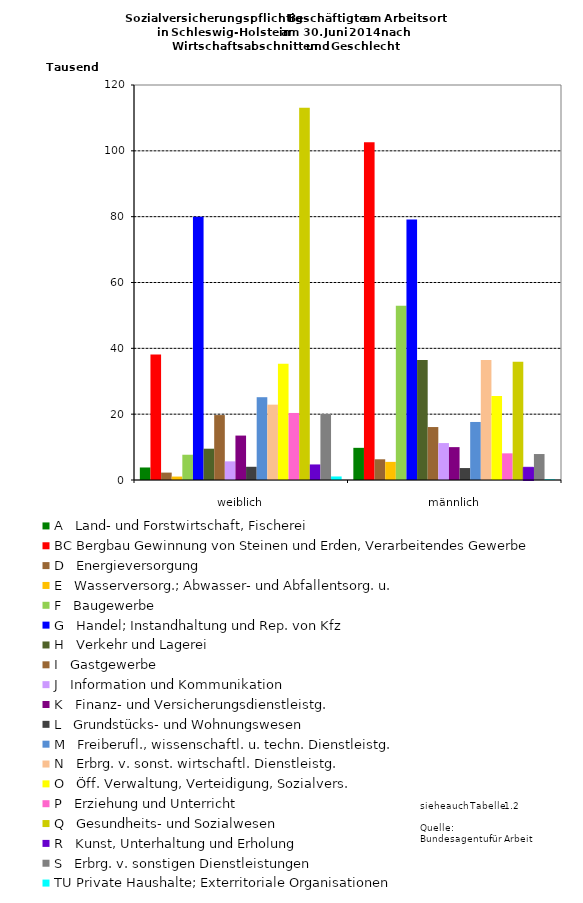
| Category | A   Land- und Forstwirtschaft, Fischerei | BC Bergbau Gewinnung von Steinen und Erden, Verarbeitendes Gewerbe | D   Energieversorgung | E   Wasserversorg.; Abwasser- und Abfallentsorg. u. | F   Baugewerbe | G   Handel; Instandhaltung und Rep. von Kfz | H   Verkehr und Lagerei | I   Gastgewerbe | J   Information und Kommunikation | K   Finanz- und Versicherungsdienstleistg. | L   Grundstücks- und Wohnungswesen | M   Freiberufl., wissenschaftl. u. techn. Dienstleistg. | N   Erbrg. v. sonst. wirtschaftl. Dienstleistg. | O   Öff. Verwaltung, Verteidigung, Sozialvers. | P   Erziehung und Unterricht | Q   Gesundheits- und Sozialwesen | R   Kunst, Unterhaltung und Erholung | S   Erbrg. v. sonstigen Dienstleistungen | TU Private Haushalte; Exterritoriale Organisationen |
|---|---|---|---|---|---|---|---|---|---|---|---|---|---|---|---|---|---|---|---|
| weiblich | 3804 | 38120 | 2249 | 1044 | 7675 | 79946 | 9509 | 19725 | 5665 | 13496 | 4015 | 25154 | 22892 | 35327 | 20364 | 113058 | 4727 | 20059 | 1075 |
| männlich | 9772 | 102579 | 6293 | 5510 | 52916 | 79118 | 36467 | 16089 | 11220 | 9985 | 3628 | 17630 | 36426 | 25526 | 8097 | 35926 | 3852 | 7890 | 218 |